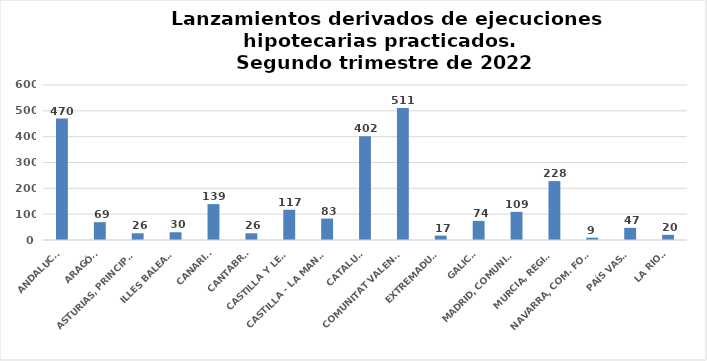
| Category | Series 0 |
|---|---|
| ANDALUCÍA | 470 |
| ARAGÓN | 69 |
| ASTURIAS, PRINCIPADO | 26 |
| ILLES BALEARS | 30 |
| CANARIAS | 139 |
| CANTABRIA | 26 |
| CASTILLA Y LEÓN | 117 |
| CASTILLA - LA MANCHA | 83 |
| CATALUÑA | 402 |
| COMUNITAT VALENCIANA | 511 |
| EXTREMADURA | 17 |
| GALICIA | 74 |
| MADRID, COMUNIDAD | 109 |
| MURCIA, REGIÓN | 228 |
| NAVARRA, COM. FORAL | 9 |
| PAÍS VASCO | 47 |
| LA RIOJA | 20 |